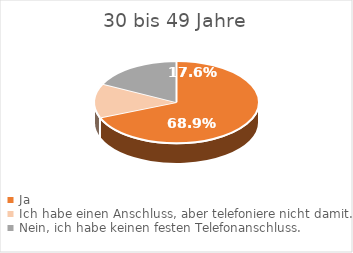
| Category | Series 0 |
|---|---|
| Ja | 68.9 |
| Ich habe einen Anschluss, aber telefoniere nicht damit. | 13.5 |
| Nein, ich habe keinen festen Telefonanschluss. | 17.6 |